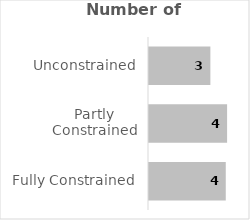
| Category | Series 0 |
|---|---|
| Fully Constrained | 4.172 |
| Partly Constrained | 4.244 |
| Unconstrained | 3.336 |